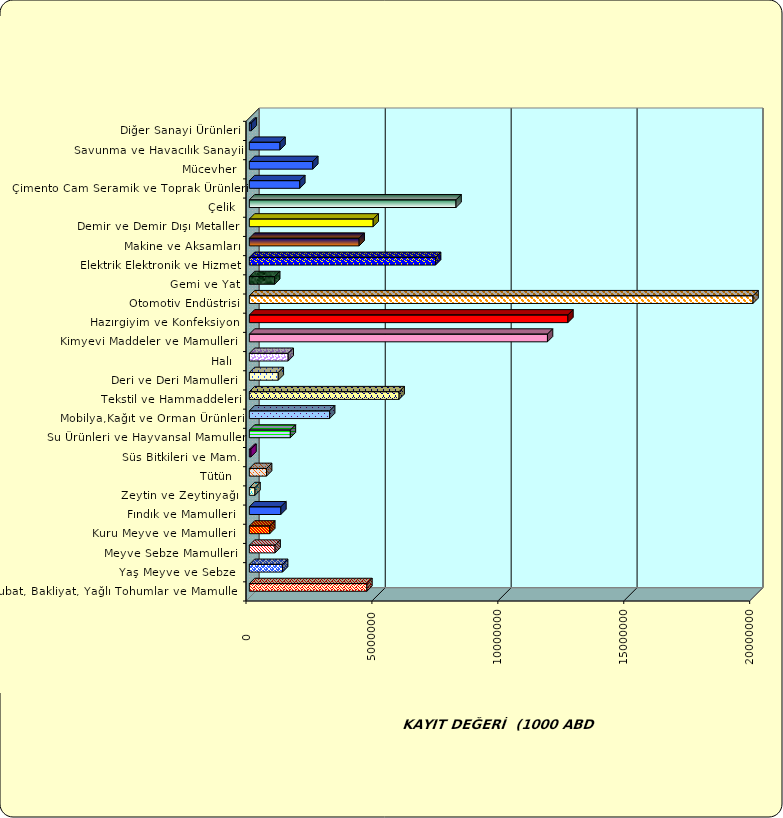
| Category | Series 0 |
|---|---|
|  Hububat, Bakliyat, Yağlı Tohumlar ve Mamulleri  | 4666992.256 |
|  Yaş Meyve ve Sebze   | 1319319.824 |
|  Meyve Sebze Mamulleri  | 1021554.559 |
|  Kuru Meyve ve Mamulleri   | 811147.291 |
|  Fındık ve Mamulleri  | 1251763.756 |
|  Zeytin ve Zeytinyağı  | 223270.367 |
|  Tütün  | 683824.929 |
|  Süs Bitkileri ve Mam. | 63158.842 |
|  Su Ürünleri ve Hayvansal Mamuller | 1628062.753 |
|  Mobilya,Kağıt ve Orman Ürünleri | 3187314.818 |
|  Tekstil ve Hammaddeleri | 5946624.326 |
|  Deri ve Deri Mamulleri  | 1147855.48 |
|  Halı  | 1541619.662 |
|  Kimyevi Maddeler ve Mamulleri   | 11837987.576 |
|  Hazırgiyim ve Konfeksiyon  | 12649362.516 |
|  Otomotiv Endüstrisi | 20772791.497 |
|  Gemi ve Yat | 1005445.838 |
|  Elektrik Elektronik ve Hizmet | 7394473.087 |
|  Makine ve Aksamları | 4359893.037 |
|  Demir ve Demir Dışı Metaller  | 4917900.631 |
|  Çelik | 8206340.104 |
|  Çimento Cam Seramik ve Toprak Ürünleri | 2003177.873 |
|  Mücevher | 2519175.221 |
|  Savunma ve Havacılık Sanayii | 1217881.628 |
|  Diğer Sanayi Ürünleri | 77527.836 |